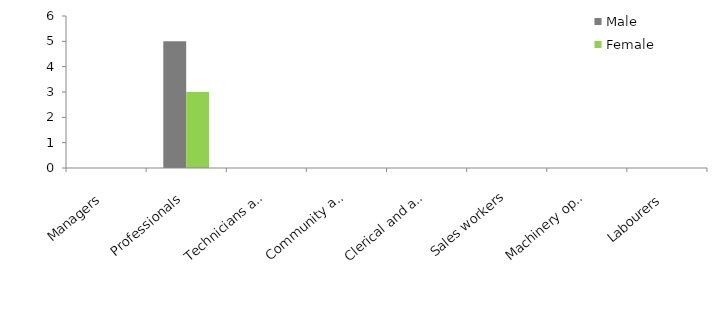
| Category | Male | Female |
|---|---|---|
| Managers | 0 | 0 |
| Professionals | 5 | 3 |
| Technicians and trades workers | 0 | 0 |
| Community and personal service workers | 0 | 0 |
| Clerical and administrative workers | 0 | 0 |
| Sales workers | 0 | 0 |
| Machinery operators and drivers | 0 | 0 |
| Labourers | 0 | 0 |